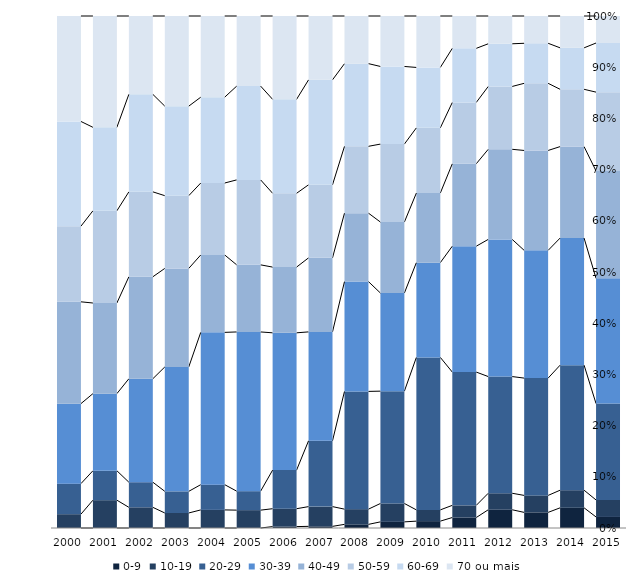
| Category | 0-9 | 10-19 | 20-29 | 30-39 | 40-49 | 50-59 | 60-69 | 70 ou mais |
|---|---|---|---|---|---|---|---|---|
| 2000.0 | 0 | 2.699 | 5.966 | 15.625 | 19.886 | 14.773 | 20.455 | 20.597 |
| 2001.0 | 0 | 5.435 | 5.745 | 15.062 | 17.702 | 18.012 | 16.304 | 21.739 |
| 2002.0 | 0 | 4.04 | 4.906 | 20.202 | 19.913 | 16.595 | 19.048 | 15.296 |
| 2003.0 | 0 | 2.934 | 4.225 | 24.296 | 19.249 | 14.202 | 17.488 | 17.606 |
| 2004.0 | 0 | 3.533 | 4.93 | 29.745 | 15.119 | 14.051 | 16.763 | 15.859 |
| 2005.0 | 0 | 3.491 | 3.706 | 31.096 | 13.104 | 16.595 | 18.314 | 13.695 |
| 2006.0 | 0.273 | 3.495 | 7.537 | 26.816 | 12.835 | 14.418 | 18.351 | 16.275 |
| 2007.0 | 0.321 | 3.856 | 12.853 | 21.272 | 14.46 | 14.267 | 20.501 | 12.468 |
| 2008.0 | 0.711 | 2.972 | 22.997 | 21.447 | 13.372 | 13.049 | 16.15 | 9.302 |
| 2009.0 | 1.198 | 3.593 | 21.937 | 19.165 | 13.86 | 15.229 | 15.161 | 9.856 |
| 2010.0 | 1.343 | 2.197 | 29.78 | 18.511 | 13.588 | 12.734 | 11.798 | 10.049 |
| 2011.0 | 2.046 | 2.377 | 26.031 | 24.586 | 16.1 | 11.977 | 10.563 | 6.32 |
| 2012.0 | 3.561 | 3.226 | 22.79 | 26.791 | 17.595 | 12.275 | 8.337 | 5.425 |
| 2013.0 | 3.05 | 3.313 | 22.914 | 24.947 | 19.513 | 13.114 | 7.819 | 5.33 |
| 2014.0 | 3.943 | 3.44 | 24.424 | 24.821 | 17.862 | 11.193 | 8.097 | 6.219 |
| 2015.0 | 2.157 | 3.319 | 18.818 | 24.461 | 20.976 | 15.4 | 9.592 | 5.277 |